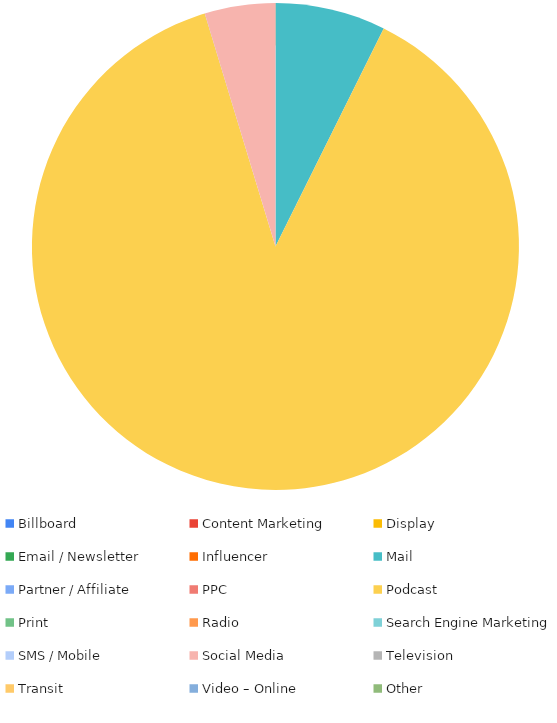
| Category | Series 0 |
|---|---|
| Billboard | 0 |
| Content Marketing | 0 |
| Display | 0 |
| Email / Newsletter | 0 |
| Influencer | 0 |
| Mail | 125 |
| Partner / Affiliate | 0 |
| PPC | 0 |
| Podcast | 1500 |
| Print | 0 |
| Radio | 0 |
| Search Engine Marketing | 0 |
| SMS / Mobile | 0 |
| Social Media | 80 |
| Television | 0 |
| Transit | 0 |
| Video – Online | 0 |
| Other | 0 |